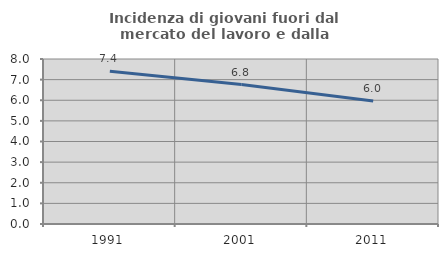
| Category | Incidenza di giovani fuori dal mercato del lavoro e dalla formazione  |
|---|---|
| 1991.0 | 7.403 |
| 2001.0 | 6.761 |
| 2011.0 | 5.964 |